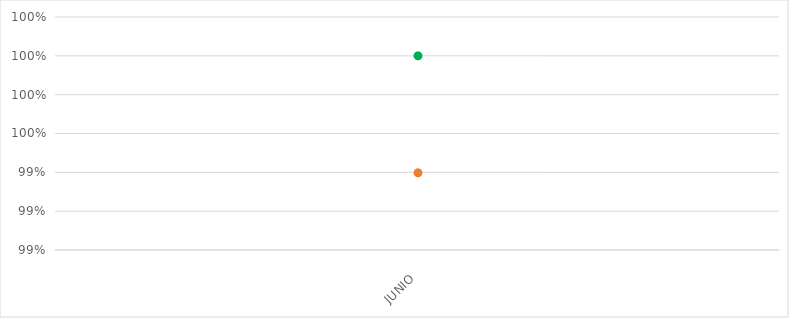
| Category | VALOR  | META PONDERADA |
|---|---|---|
| JUNIO | 0.994 | 1 |